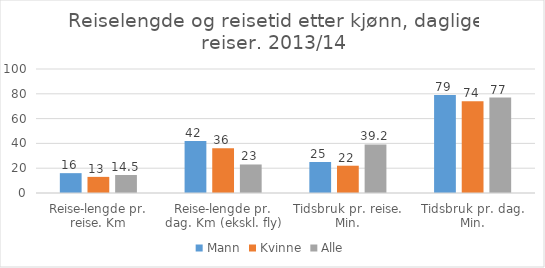
| Category | Mann | Kvinne | Alle |
|---|---|---|---|
| Reise-lengde pr. reise. Km | 16 | 13 | 14.5 |
| Reise-lengde pr. dag. Km (ekskl. fly) | 42 | 36 | 23 |
| Tidsbruk pr. reise. Min. | 25 | 22 | 39.2 |
| Tidsbruk pr. dag. Min. | 79 | 74 | 77 |